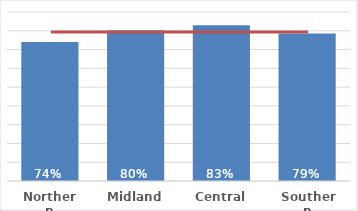
| Category | Māori |
|---|---|
| Northern | 0.741 |
| Midland | 0.802 |
| Central | 0.83 |
| Southern | 0.785 |